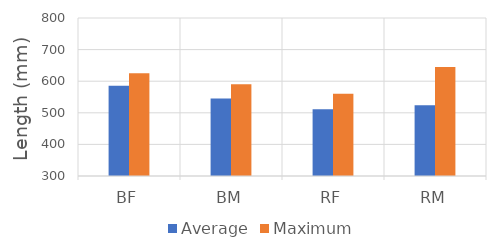
| Category | Average | Maximum |
|---|---|---|
| BF | 585.667 | 625 |
| BM | 545 | 590 |
| RF | 511.512 | 560 |
| RM | 524.111 | 645 |